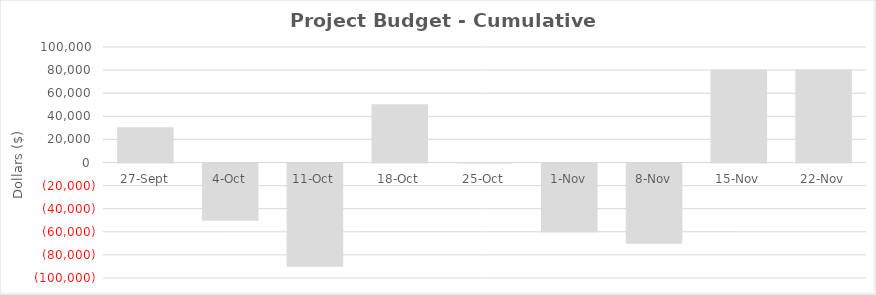
| Category | Cumulative Cashflow |
|---|---|
| 2019-09-27 | 30500 |
| 2019-10-04 | -49500 |
| 2019-10-11 | -89500 |
| 2019-10-18 | 50500 |
| 2019-10-25 | 500 |
| 2019-11-01 | -59500 |
| 2019-11-08 | -69500 |
| 2019-11-15 | 80450 |
| 2019-11-22 | 80450 |